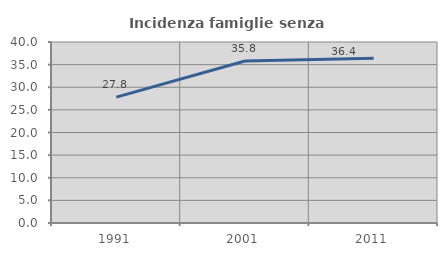
| Category | Incidenza famiglie senza nuclei |
|---|---|
| 1991.0 | 27.811 |
| 2001.0 | 35.807 |
| 2011.0 | 36.43 |